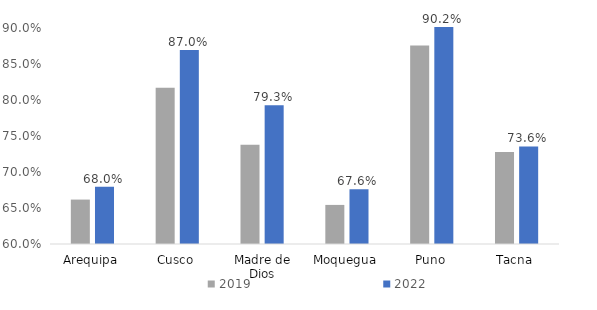
| Category | 2019 | 2022 |
|---|---|---|
| Arequipa | 0.662 | 0.68 |
| Cusco | 0.817 | 0.87 |
| Madre de Dios | 0.738 | 0.793 |
| Moquegua | 0.654 | 0.676 |
| Puno | 0.876 | 0.902 |
| Tacna | 0.728 | 0.736 |